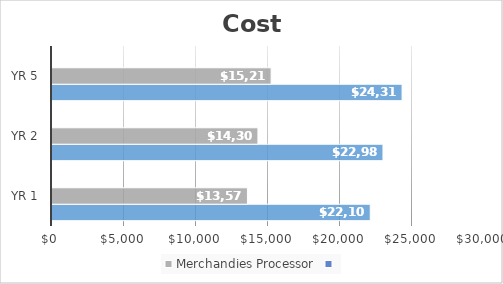
| Category | Store/Warehouse Mgr. | Merchandies Processor | Series 2 |
|---|---|---|---|
| YR 1 | 22100 | 13572 |  |
| YR 2 | 22984 | 14302 |  |
| YR 5 | 24310 | 15217 |  |